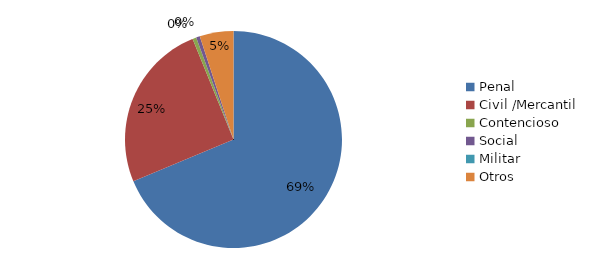
| Category | Series 0 |
|---|---|
| Penal | 123 |
| Civil /Mercantil | 45 |
| Contencioso | 1 |
| Social | 1 |
| Militar | 0 |
| Otros | 9 |